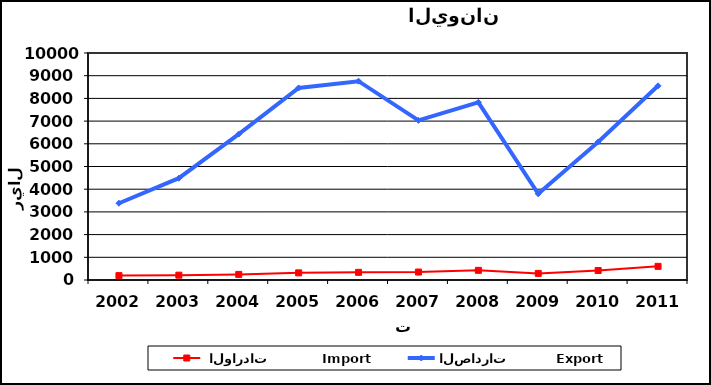
| Category |  الواردات           Import | الصادرات          Export |
|---|---|---|
| 2002.0 | 193 | 3382 |
| 2003.0 | 213 | 4485 |
| 2004.0 | 247 | 6430 |
| 2005.0 | 314 | 8461 |
| 2006.0 | 337 | 8758 |
| 2007.0 | 351 | 7032 |
| 2008.0 | 426 | 7827 |
| 2009.0 | 290 | 3799 |
| 2010.0 | 418 | 6082 |
| 2011.0 | 601 | 8555 |